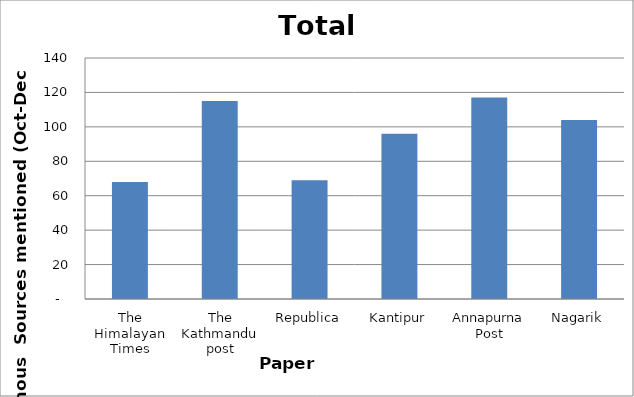
| Category | Total |
|---|---|
| The Himalayan Times | 68 |
| The Kathmandu post | 115 |
| Republica | 69 |
| Kantipur | 96 |
| Annapurna Post | 117 |
| Nagarik | 104 |